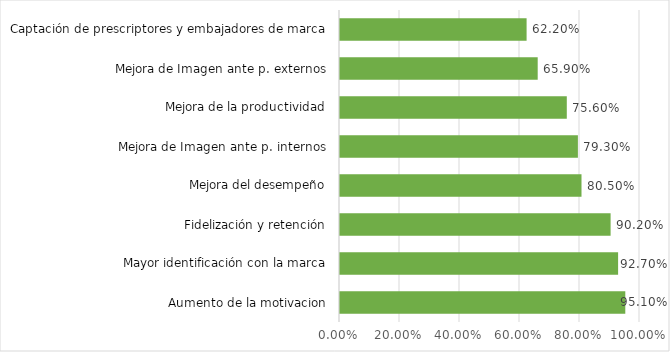
| Category | Series 0 |
|---|---|
| Aumento de la motivacion | 0.951 |
| Mayor identificación con la marca | 0.927 |
| Fidelización y retención | 0.902 |
| Mejora del desempeño | 0.805 |
| Mejora de Imagen ante p. internos | 0.793 |
| Mejora de la productividad | 0.756 |
| Mejora de Imagen ante p. externos | 0.659 |
| Captación de prescriptores y embajadores de marca | 0.622 |